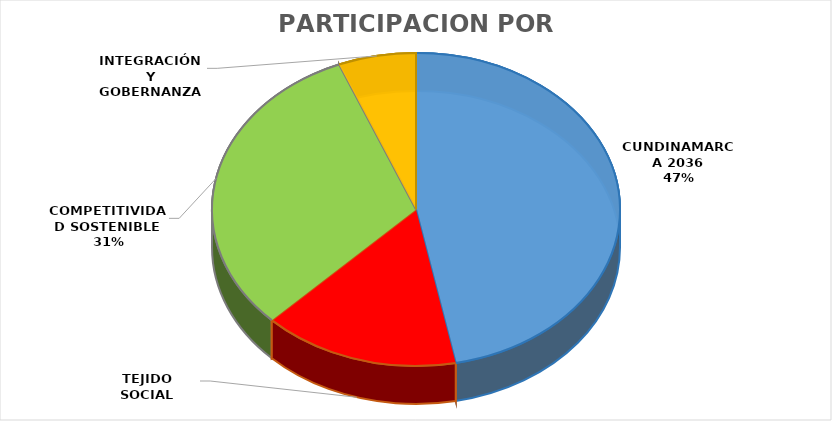
| Category | Series 0 |
|---|---|
| CUNDINAMARCA 2036 | 0.469 |
| TEJIDO SOCIAL | 0.156 |
| COMPETITIVIDAD SOSTENIBLE | 0.313 |
| INTEGRACIÓN Y GOBERNANZA | 0.062 |